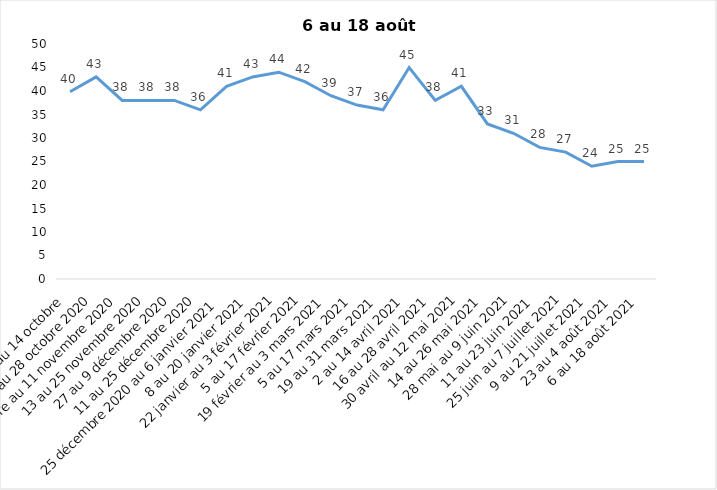
| Category | Toujours aux trois mesures |
|---|---|
| 2 au 14 octobre  | 39.85 |
| 16 au 28 octobre 2020 | 43 |
| 30 octobre au 11 novembre 2020 | 38 |
| 13 au 25 novembre 2020 | 38 |
| 27 au 9 décembre 2020 | 38 |
| 11 au 25 décembre 2020 | 36 |
| 25 décembre 2020 au 6 janvier 2021 | 41 |
| 8 au 20 janvier 2021 | 43 |
| 22 janvier au 3 février 2021 | 44 |
| 5 au 17 février 2021 | 42 |
| 19 février au 3 mars 2021 | 39 |
| 5 au 17 mars 2021 | 37 |
| 19 au 31 mars 2021 | 36 |
| 2 au 14 avril 2021 | 45 |
| 16 au 28 avril 2021 | 38 |
| 30 avril au 12 mai 2021 | 41 |
| 14 au 26 mai 2021 | 33 |
| 28 mai au 9 juin 2021 | 31 |
| 11 au 23 juin 2021 | 28 |
| 25 juin au 7 juillet 2021 | 27 |
| 9 au 21 juillet 2021 | 24 |
| 23 au 4 août 2021 | 25 |
| 6 au 18 août 2021 | 25 |